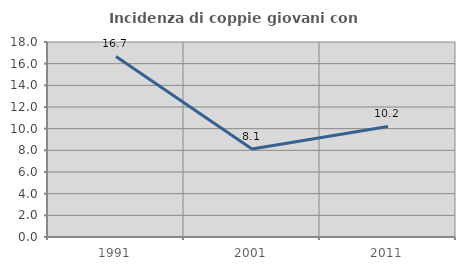
| Category | Incidenza di coppie giovani con figli |
|---|---|
| 1991.0 | 16.667 |
| 2001.0 | 8.13 |
| 2011.0 | 10.204 |